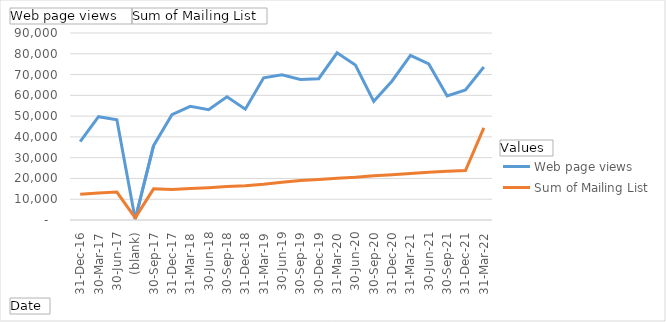
| Category | Web page views  | Sum of Mailing List |
|---|---|---|
| 31-Dec-16 | 37669 | 12348 |
| 30-Mar-17 | 49730 | 13039 |
| 30-Jun-17 | 48242 | 13463 |
| (blank) | 365 | 1016 |
| 30-Sep-17 | 35780 | 14981 |
| 31-Dec-17 | 50705 | 14629 |
| 31-Mar-18 | 54689 | 15174 |
| 30-Jun-18 | 53046 | 15546 |
| 30-Sep-18 | 59278 | 16102 |
| 31-Dec-18 | 53339 | 16456 |
| 31-Mar-19 | 68455 | 17221 |
| 30-Jun-19 | 69888 | 18192 |
| 30-Sep-19 | 67662 | 18983 |
| 30-Dec-19 | 68019 | 19470 |
| 31-Mar-20 | 80472 | 20092 |
| 30-Jun-20 | 74564 | 20572 |
| 30-Sep-20 | 57126 | 21284 |
| 31-Dec-20 | 66908 | 21814 |
| 31-Mar-21 | 79239 | 22397 |
| 30-Jun-21 | 75123 | 22926 |
| 30-Sep-21 | 59676 | 23439 |
| 31-Dec-21 | 62617 | 23776 |
| 31-Mar-22 | 73612 | 44359 |